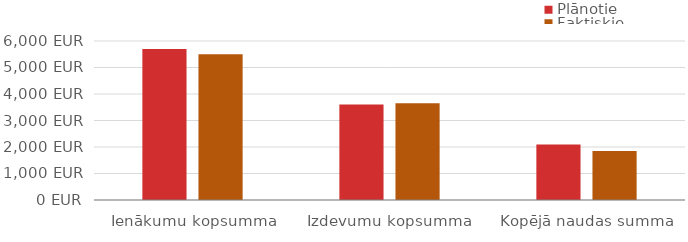
| Category | Plānotie | Faktiskie |
|---|---|---|
| Ienākumu kopsumma | 5700 | 5500 |
| Izdevumu kopsumma | 3603 | 3655 |
| Kopējā naudas summa | 2097 | 1845 |